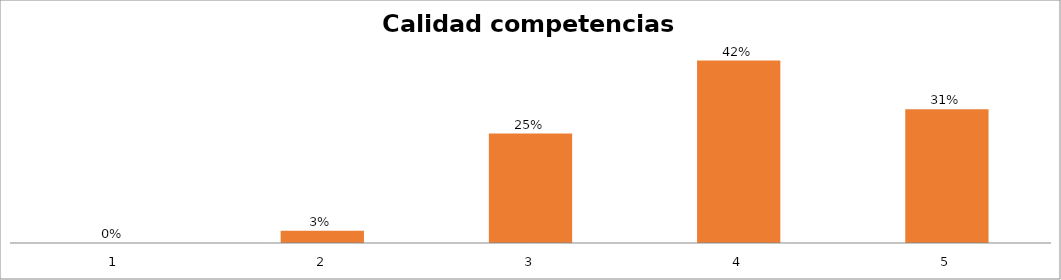
| Category | Series 1 |
|---|---|
| 0 | 0 |
| 1 | 0.028 |
| 2 | 0.25 |
| 3 | 0.417 |
| 4 | 0.306 |